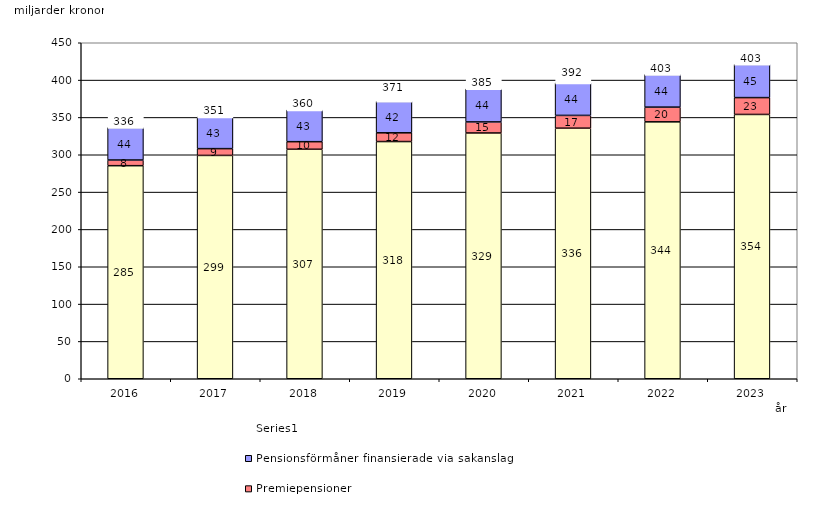
| Category | Inkomstpension och tilläggspension m.m. | Premiepensioner | Pensionsförmåner finansierade via sakanslag | Series 0 |
|---|---|---|---|---|
| 2016.0 | 285.357 | 7.598 | 43.541 | 20 |
| 2017.0 | 299.103 | 9.081 | 42.508 | 20 |
| 2018.0 | 307.355 | 10.141 | 42.538 | 20 |
| 2019.0 | 317.676 | 11.72 | 42.125 | 20 |
| 2020.0 | 329.161 | 14.825 | 44.24 | 20 |
| 2021.0 | 335.588 | 17.118 | 43.518 | 20 |
| 2022.0 | 344.077 | 19.724 | 43.764 | 20 |
| 2023.0 | 353.985 | 22.551 | 44.541 | 20 |